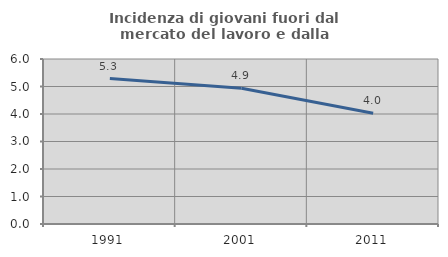
| Category | Incidenza di giovani fuori dal mercato del lavoro e dalla formazione  |
|---|---|
| 1991.0 | 5.288 |
| 2001.0 | 4.938 |
| 2011.0 | 4.027 |